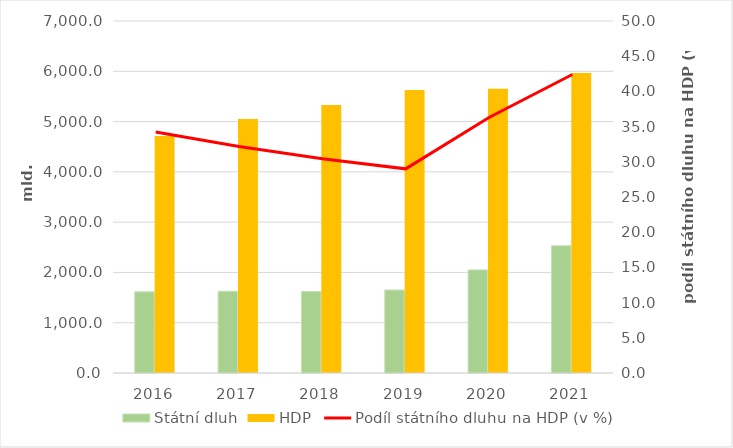
| Category | Státní dluh | HDP |
|---|---|---|
| 2016.0 | 1613.4 | 4715 |
| 2017.0 | 1624.7 | 5050 |
| 2018.0 | 1622 | 5329 |
| 2019.0 | 1650.5 | 5627 |
| 2020.0 | 2049.7 | 5652 |
| 2021.0 | 2530 | 5966.981 |